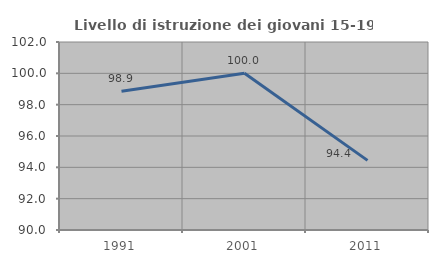
| Category | Livello di istruzione dei giovani 15-19 anni |
|---|---|
| 1991.0 | 98.851 |
| 2001.0 | 100 |
| 2011.0 | 94.444 |